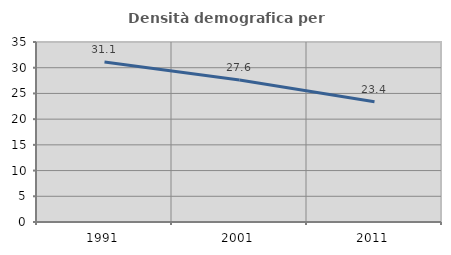
| Category | Densità demografica |
|---|---|
| 1991.0 | 31.104 |
| 2001.0 | 27.597 |
| 2011.0 | 23.362 |